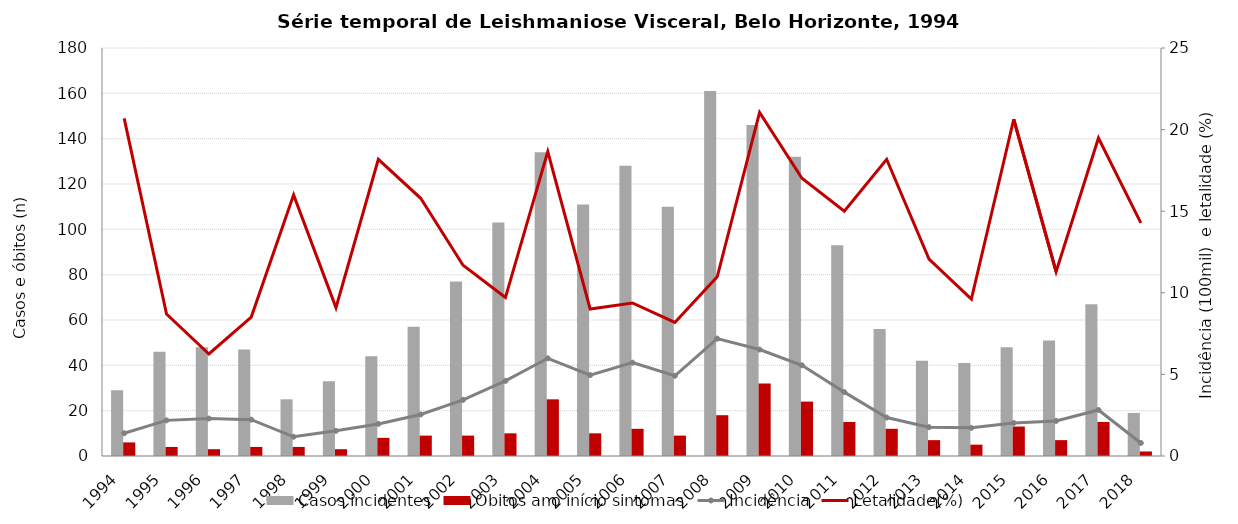
| Category | Casos incidentes | Óbitos ano início sintomas |
|---|---|---|
| 1994 | 29 | 6 |
| 1995 | 46 | 4 |
| 1996 | 48 | 3 |
| 1997 | 47 | 4 |
| 1998 | 25 | 4 |
| 1999 | 33 | 3 |
| 2000 | 44 | 8 |
| 2001 | 57 | 9 |
| 2002 | 77 | 9 |
| 2003 | 103 | 10 |
| 2004 | 134 | 25 |
| 2005 | 111 | 10 |
| 2006 | 128 | 12 |
| 2007 | 110 | 9 |
| 2008 | 161 | 18 |
| 2009 | 146 | 32 |
| 2010 | 132 | 24 |
| 2011 | 93 | 15 |
| 2012 | 56 | 12 |
| 2013 | 42 | 7 |
| 2014 | 41 | 5 |
| 2015 | 48 | 13 |
| 2016 | 51 | 7 |
| 2017 | 67 | 15 |
| 2018 | 19 | 2 |